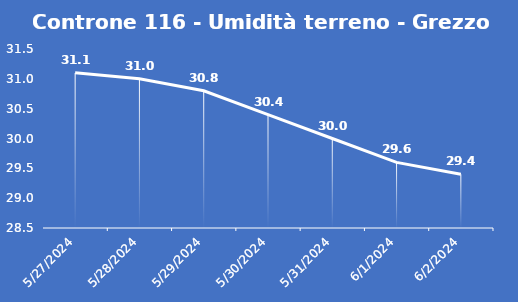
| Category | Controne 116 - Umidità terreno - Grezzo (%VWC) |
|---|---|
| 5/27/24 | 31.1 |
| 5/28/24 | 31 |
| 5/29/24 | 30.8 |
| 5/30/24 | 30.4 |
| 5/31/24 | 30 |
| 6/1/24 | 29.6 |
| 6/2/24 | 29.4 |